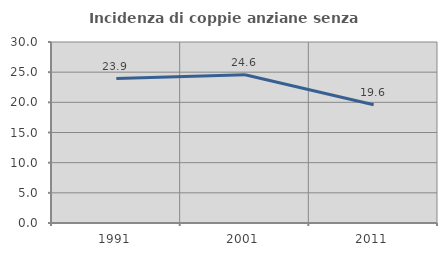
| Category | Incidenza di coppie anziane senza figli  |
|---|---|
| 1991.0 | 23.944 |
| 2001.0 | 24.561 |
| 2011.0 | 19.608 |